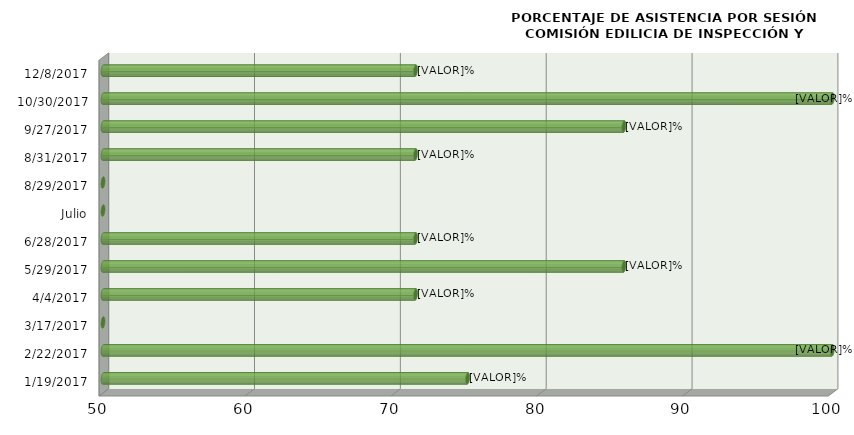
| Category | Series 0 |
|---|---|
| 19/01/2017 | 75 |
| 22/02/2017 | 100 |
| 17/03/2017 | 0 |
| 04/04/2017 | 71.429 |
| 29/05/2017 | 85.714 |
| 28/06/2017 | 71.429 |
| Julio | 0 |
| 29/08/2017 | 0 |
| 31/08/2017 | 71.429 |
| 27/09/2017 | 85.714 |
| 30/10/2017 | 100 |
| 08/12/2017 | 71.429 |